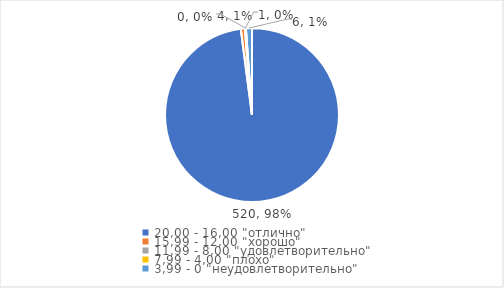
| Category | Series 0 | Series 1 |
|---|---|---|
| 20,00 - 16,00 "отлично" | 520 | 0.979 |
| 15,99 - 12,00 "хорошо" | 4 | 0.008 |
| 11,99 - 8,00 "удовлетворительно" | 1 | 0.002 |
| 7,99 - 4,00 "плохо" | 0 | 0 |
| 3,99 - 0 "неудовлетворительно" | 6 | 0.011 |